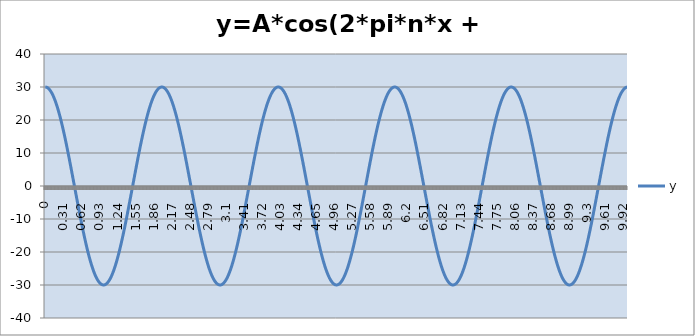
| Category | y |
|---|---|
| 0.0 | 30 |
| 0.01 | 29.985 |
| 0.02 | 29.941 |
| 0.03 | 29.867 |
| 0.04 | 29.763 |
| 0.05 | 29.631 |
| 0.060000000000000005 | 29.469 |
| 0.07 | 29.278 |
| 0.08 | 29.057 |
| 0.09 | 28.809 |
| 0.09999999999999999 | 28.532 |
| 0.10999999999999999 | 28.226 |
| 0.11999999999999998 | 27.893 |
| 0.12999999999999998 | 27.533 |
| 0.13999999999999999 | 27.145 |
| 0.15 | 26.73 |
| 0.16 | 26.289 |
| 0.17 | 25.822 |
| 0.18000000000000002 | 25.33 |
| 0.19000000000000003 | 24.812 |
| 0.20000000000000004 | 24.271 |
| 0.21000000000000005 | 23.705 |
| 0.22000000000000006 | 23.115 |
| 0.23000000000000007 | 22.503 |
| 0.24000000000000007 | 21.869 |
| 0.25000000000000006 | 21.213 |
| 0.26000000000000006 | 20.536 |
| 0.2700000000000001 | 19.839 |
| 0.2800000000000001 | 19.123 |
| 0.2900000000000001 | 18.387 |
| 0.3000000000000001 | 17.634 |
| 0.3100000000000001 | 16.863 |
| 0.3200000000000001 | 16.075 |
| 0.3300000000000001 | 15.271 |
| 0.34000000000000014 | 14.453 |
| 0.35000000000000014 | 13.62 |
| 0.36000000000000015 | 12.773 |
| 0.37000000000000016 | 11.914 |
| 0.38000000000000017 | 11.044 |
| 0.3900000000000002 | 10.162 |
| 0.4000000000000002 | 9.271 |
| 0.4100000000000002 | 8.37 |
| 0.4200000000000002 | 7.461 |
| 0.4300000000000002 | 6.544 |
| 0.4400000000000002 | 5.621 |
| 0.45000000000000023 | 4.693 |
| 0.46000000000000024 | 3.76 |
| 0.47000000000000025 | 2.823 |
| 0.48000000000000026 | 1.884 |
| 0.49000000000000027 | 0.942 |
| 0.5000000000000002 | 0 |
| 0.5100000000000002 | -0.942 |
| 0.5200000000000002 | -1.884 |
| 0.5300000000000002 | -2.823 |
| 0.5400000000000003 | -3.76 |
| 0.5500000000000003 | -4.693 |
| 0.5600000000000003 | -5.621 |
| 0.5700000000000003 | -6.544 |
| 0.5800000000000003 | -7.461 |
| 0.5900000000000003 | -8.37 |
| 0.6000000000000003 | -9.271 |
| 0.6100000000000003 | -10.162 |
| 0.6200000000000003 | -11.044 |
| 0.6300000000000003 | -11.914 |
| 0.6400000000000003 | -12.773 |
| 0.6500000000000004 | -13.62 |
| 0.6600000000000004 | -14.453 |
| 0.6700000000000004 | -15.271 |
| 0.6800000000000004 | -16.075 |
| 0.6900000000000004 | -16.863 |
| 0.7000000000000004 | -17.634 |
| 0.7100000000000004 | -18.387 |
| 0.7200000000000004 | -19.123 |
| 0.7300000000000004 | -19.839 |
| 0.7400000000000004 | -20.536 |
| 0.7500000000000004 | -21.213 |
| 0.7600000000000005 | -21.869 |
| 0.7700000000000005 | -22.503 |
| 0.7800000000000005 | -23.115 |
| 0.7900000000000005 | -23.705 |
| 0.8000000000000005 | -24.271 |
| 0.8100000000000005 | -24.812 |
| 0.8200000000000005 | -25.33 |
| 0.8300000000000005 | -25.822 |
| 0.8400000000000005 | -26.289 |
| 0.8500000000000005 | -26.73 |
| 0.8600000000000005 | -27.145 |
| 0.8700000000000006 | -27.533 |
| 0.8800000000000006 | -27.893 |
| 0.8900000000000006 | -28.226 |
| 0.9000000000000006 | -28.532 |
| 0.9100000000000006 | -28.809 |
| 0.9200000000000006 | -29.057 |
| 0.9300000000000006 | -29.278 |
| 0.9400000000000006 | -29.469 |
| 0.9500000000000006 | -29.631 |
| 0.9600000000000006 | -29.763 |
| 0.9700000000000006 | -29.867 |
| 0.9800000000000006 | -29.941 |
| 0.9900000000000007 | -29.985 |
| 1.0000000000000007 | -30 |
| 1.0100000000000007 | -29.985 |
| 1.0200000000000007 | -29.941 |
| 1.0300000000000007 | -29.867 |
| 1.0400000000000007 | -29.763 |
| 1.0500000000000007 | -29.631 |
| 1.0600000000000007 | -29.469 |
| 1.0700000000000007 | -29.278 |
| 1.0800000000000007 | -29.057 |
| 1.0900000000000007 | -28.809 |
| 1.1000000000000008 | -28.532 |
| 1.1100000000000008 | -28.226 |
| 1.1200000000000008 | -27.893 |
| 1.1300000000000008 | -27.533 |
| 1.1400000000000008 | -27.145 |
| 1.1500000000000008 | -26.73 |
| 1.1600000000000008 | -26.289 |
| 1.1700000000000008 | -25.822 |
| 1.1800000000000008 | -25.33 |
| 1.1900000000000008 | -24.812 |
| 1.2000000000000008 | -24.271 |
| 1.2100000000000009 | -23.705 |
| 1.2200000000000009 | -23.115 |
| 1.2300000000000009 | -22.503 |
| 1.2400000000000009 | -21.869 |
| 1.2500000000000009 | -21.213 |
| 1.260000000000001 | -20.536 |
| 1.270000000000001 | -19.839 |
| 1.280000000000001 | -19.123 |
| 1.290000000000001 | -18.387 |
| 1.300000000000001 | -17.634 |
| 1.310000000000001 | -16.863 |
| 1.320000000000001 | -16.075 |
| 1.330000000000001 | -15.271 |
| 1.340000000000001 | -14.453 |
| 1.350000000000001 | -13.62 |
| 1.360000000000001 | -12.773 |
| 1.370000000000001 | -11.914 |
| 1.380000000000001 | -11.044 |
| 1.390000000000001 | -10.162 |
| 1.400000000000001 | -9.271 |
| 1.410000000000001 | -8.37 |
| 1.420000000000001 | -7.461 |
| 1.430000000000001 | -6.544 |
| 1.440000000000001 | -5.621 |
| 1.450000000000001 | -4.693 |
| 1.460000000000001 | -3.76 |
| 1.470000000000001 | -2.823 |
| 1.480000000000001 | -1.884 |
| 1.490000000000001 | -0.942 |
| 1.500000000000001 | 0 |
| 1.5100000000000011 | 0.942 |
| 1.5200000000000011 | 1.884 |
| 1.5300000000000011 | 2.823 |
| 1.5400000000000011 | 3.76 |
| 1.5500000000000012 | 4.693 |
| 1.5600000000000012 | 5.621 |
| 1.5700000000000012 | 6.544 |
| 1.5800000000000012 | 7.461 |
| 1.5900000000000012 | 8.37 |
| 1.6000000000000012 | 9.271 |
| 1.6100000000000012 | 10.162 |
| 1.6200000000000012 | 11.044 |
| 1.6300000000000012 | 11.914 |
| 1.6400000000000012 | 12.773 |
| 1.6500000000000012 | 13.62 |
| 1.6600000000000013 | 14.453 |
| 1.6700000000000013 | 15.271 |
| 1.6800000000000013 | 16.075 |
| 1.6900000000000013 | 16.863 |
| 1.7000000000000013 | 17.634 |
| 1.7100000000000013 | 18.387 |
| 1.7200000000000013 | 19.123 |
| 1.7300000000000013 | 19.839 |
| 1.7400000000000013 | 20.536 |
| 1.7500000000000013 | 21.213 |
| 1.7600000000000013 | 21.869 |
| 1.7700000000000014 | 22.503 |
| 1.7800000000000014 | 23.115 |
| 1.7900000000000014 | 23.705 |
| 1.8000000000000014 | 24.271 |
| 1.8100000000000014 | 24.812 |
| 1.8200000000000014 | 25.33 |
| 1.8300000000000014 | 25.822 |
| 1.8400000000000014 | 26.289 |
| 1.8500000000000014 | 26.73 |
| 1.8600000000000014 | 27.145 |
| 1.8700000000000014 | 27.533 |
| 1.8800000000000014 | 27.893 |
| 1.8900000000000015 | 28.226 |
| 1.9000000000000015 | 28.532 |
| 1.9100000000000015 | 28.809 |
| 1.9200000000000015 | 29.057 |
| 1.9300000000000015 | 29.278 |
| 1.9400000000000015 | 29.469 |
| 1.9500000000000015 | 29.631 |
| 1.9600000000000015 | 29.763 |
| 1.9700000000000015 | 29.867 |
| 1.9800000000000015 | 29.941 |
| 1.9900000000000015 | 29.985 |
| 2.0000000000000013 | 30 |
| 2.010000000000001 | 29.985 |
| 2.020000000000001 | 29.941 |
| 2.0300000000000007 | 29.867 |
| 2.0400000000000005 | 29.763 |
| 2.0500000000000003 | 29.631 |
| 2.06 | 29.469 |
| 2.07 | 29.278 |
| 2.0799999999999996 | 29.057 |
| 2.0899999999999994 | 28.809 |
| 2.099999999999999 | 28.532 |
| 2.109999999999999 | 28.226 |
| 2.1199999999999988 | 27.893 |
| 2.1299999999999986 | 27.533 |
| 2.1399999999999983 | 27.145 |
| 2.149999999999998 | 26.73 |
| 2.159999999999998 | 26.289 |
| 2.1699999999999977 | 25.822 |
| 2.1799999999999975 | 25.33 |
| 2.1899999999999973 | 24.812 |
| 2.199999999999997 | 24.271 |
| 2.209999999999997 | 23.705 |
| 2.2199999999999966 | 23.115 |
| 2.2299999999999964 | 22.503 |
| 2.239999999999996 | 21.869 |
| 2.249999999999996 | 21.213 |
| 2.259999999999996 | 20.536 |
| 2.2699999999999956 | 19.839 |
| 2.2799999999999954 | 19.123 |
| 2.289999999999995 | 18.387 |
| 2.299999999999995 | 17.634 |
| 2.3099999999999947 | 16.863 |
| 2.3199999999999945 | 16.075 |
| 2.3299999999999943 | 15.271 |
| 2.339999999999994 | 14.453 |
| 2.349999999999994 | 13.62 |
| 2.3599999999999937 | 12.773 |
| 2.3699999999999934 | 11.914 |
| 2.3799999999999932 | 11.044 |
| 2.389999999999993 | 10.162 |
| 2.399999999999993 | 9.271 |
| 2.4099999999999926 | 8.37 |
| 2.4199999999999924 | 7.461 |
| 2.429999999999992 | 6.544 |
| 2.439999999999992 | 5.621 |
| 2.4499999999999917 | 4.693 |
| 2.4599999999999915 | 3.76 |
| 2.4699999999999913 | 2.823 |
| 2.479999999999991 | 1.884 |
| 2.489999999999991 | 0.942 |
| 2.4999999999999907 | 0 |
| 2.5099999999999905 | -0.942 |
| 2.5199999999999902 | -1.884 |
| 2.52999999999999 | -2.823 |
| 2.53999999999999 | -3.76 |
| 2.5499999999999896 | -4.693 |
| 2.5599999999999894 | -5.621 |
| 2.569999999999989 | -6.544 |
| 2.579999999999989 | -7.461 |
| 2.5899999999999888 | -8.37 |
| 2.5999999999999885 | -9.271 |
| 2.6099999999999883 | -10.162 |
| 2.619999999999988 | -11.044 |
| 2.629999999999988 | -11.914 |
| 2.6399999999999877 | -12.773 |
| 2.6499999999999875 | -13.62 |
| 2.6599999999999873 | -14.453 |
| 2.669999999999987 | -15.271 |
| 2.679999999999987 | -16.075 |
| 2.6899999999999866 | -16.863 |
| 2.6999999999999864 | -17.634 |
| 2.709999999999986 | -18.387 |
| 2.719999999999986 | -19.123 |
| 2.7299999999999858 | -19.839 |
| 2.7399999999999856 | -20.536 |
| 2.7499999999999853 | -21.213 |
| 2.759999999999985 | -21.869 |
| 2.769999999999985 | -22.503 |
| 2.7799999999999847 | -23.115 |
| 2.7899999999999845 | -23.705 |
| 2.7999999999999843 | -24.271 |
| 2.809999999999984 | -24.812 |
| 2.819999999999984 | -25.33 |
| 2.8299999999999836 | -25.822 |
| 2.8399999999999834 | -26.289 |
| 2.849999999999983 | -26.73 |
| 2.859999999999983 | -27.145 |
| 2.869999999999983 | -27.533 |
| 2.8799999999999826 | -27.893 |
| 2.8899999999999824 | -28.226 |
| 2.899999999999982 | -28.532 |
| 2.909999999999982 | -28.809 |
| 2.9199999999999817 | -29.057 |
| 2.9299999999999815 | -29.278 |
| 2.9399999999999813 | -29.469 |
| 2.949999999999981 | -29.631 |
| 2.959999999999981 | -29.763 |
| 2.9699999999999807 | -29.867 |
| 2.9799999999999804 | -29.941 |
| 2.9899999999999802 | -29.985 |
| 2.99999999999998 | -30 |
| 3.00999999999998 | -29.985 |
| 3.0199999999999796 | -29.941 |
| 3.0299999999999794 | -29.867 |
| 3.039999999999979 | -29.763 |
| 3.049999999999979 | -29.631 |
| 3.0599999999999787 | -29.469 |
| 3.0699999999999785 | -29.278 |
| 3.0799999999999783 | -29.057 |
| 3.089999999999978 | -28.809 |
| 3.099999999999978 | -28.532 |
| 3.1099999999999777 | -28.226 |
| 3.1199999999999775 | -27.893 |
| 3.1299999999999772 | -27.533 |
| 3.139999999999977 | -27.145 |
| 3.149999999999977 | -26.73 |
| 3.1599999999999766 | -26.289 |
| 3.1699999999999764 | -25.822 |
| 3.179999999999976 | -25.33 |
| 3.189999999999976 | -24.812 |
| 3.1999999999999758 | -24.271 |
| 3.2099999999999755 | -23.705 |
| 3.2199999999999753 | -23.115 |
| 3.229999999999975 | -22.503 |
| 3.239999999999975 | -21.869 |
| 3.2499999999999747 | -21.213 |
| 3.2599999999999745 | -20.536 |
| 3.2699999999999743 | -19.839 |
| 3.279999999999974 | -19.123 |
| 3.289999999999974 | -18.387 |
| 3.2999999999999736 | -17.634 |
| 3.3099999999999734 | -16.863 |
| 3.319999999999973 | -16.075 |
| 3.329999999999973 | -15.271 |
| 3.3399999999999728 | -14.453 |
| 3.3499999999999726 | -13.62 |
| 3.3599999999999723 | -12.773 |
| 3.369999999999972 | -11.914 |
| 3.379999999999972 | -11.044 |
| 3.3899999999999717 | -10.162 |
| 3.3999999999999715 | -9.271 |
| 3.4099999999999713 | -8.37 |
| 3.419999999999971 | -7.461 |
| 3.429999999999971 | -6.544 |
| 3.4399999999999706 | -5.621 |
| 3.4499999999999704 | -4.693 |
| 3.45999999999997 | -3.76 |
| 3.46999999999997 | -2.823 |
| 3.47999999999997 | -1.884 |
| 3.4899999999999696 | -0.942 |
| 3.4999999999999694 | 0 |
| 3.509999999999969 | 0.942 |
| 3.519999999999969 | 1.884 |
| 3.5299999999999687 | 2.823 |
| 3.5399999999999685 | 3.76 |
| 3.5499999999999683 | 4.693 |
| 3.559999999999968 | 5.621 |
| 3.569999999999968 | 6.544 |
| 3.5799999999999677 | 7.461 |
| 3.5899999999999674 | 8.37 |
| 3.5999999999999672 | 9.271 |
| 3.609999999999967 | 10.162 |
| 3.619999999999967 | 11.044 |
| 3.6299999999999666 | 11.914 |
| 3.6399999999999664 | 12.773 |
| 3.649999999999966 | 13.62 |
| 3.659999999999966 | 14.453 |
| 3.6699999999999657 | 15.271 |
| 3.6799999999999655 | 16.075 |
| 3.6899999999999653 | 16.863 |
| 3.699999999999965 | 17.634 |
| 3.709999999999965 | 18.387 |
| 3.7199999999999647 | 19.123 |
| 3.7299999999999645 | 19.839 |
| 3.7399999999999642 | 20.536 |
| 3.749999999999964 | 21.213 |
| 3.759999999999964 | 21.869 |
| 3.7699999999999636 | 22.503 |
| 3.7799999999999634 | 23.115 |
| 3.789999999999963 | 23.705 |
| 3.799999999999963 | 24.271 |
| 3.8099999999999627 | 24.812 |
| 3.8199999999999625 | 25.33 |
| 3.8299999999999623 | 25.822 |
| 3.839999999999962 | 26.289 |
| 3.849999999999962 | 26.73 |
| 3.8599999999999617 | 27.145 |
| 3.8699999999999615 | 27.533 |
| 3.8799999999999613 | 27.893 |
| 3.889999999999961 | 28.226 |
| 3.899999999999961 | 28.532 |
| 3.9099999999999606 | 28.809 |
| 3.9199999999999604 | 29.057 |
| 3.92999999999996 | 29.278 |
| 3.93999999999996 | 29.469 |
| 3.9499999999999598 | 29.631 |
| 3.9599999999999596 | 29.763 |
| 3.9699999999999593 | 29.867 |
| 3.979999999999959 | 29.941 |
| 3.989999999999959 | 29.985 |
| 3.9999999999999587 | 30 |
| 4.009999999999959 | 29.985 |
| 4.019999999999959 | 29.941 |
| 4.0299999999999585 | 29.867 |
| 4.039999999999958 | 29.763 |
| 4.049999999999958 | 29.631 |
| 4.059999999999958 | 29.469 |
| 4.069999999999958 | 29.278 |
| 4.079999999999957 | 29.057 |
| 4.089999999999957 | 28.809 |
| 4.099999999999957 | 28.532 |
| 4.109999999999957 | 28.226 |
| 4.119999999999957 | 27.893 |
| 4.129999999999956 | 27.533 |
| 4.139999999999956 | 27.145 |
| 4.149999999999956 | 26.73 |
| 4.159999999999956 | 26.289 |
| 4.1699999999999555 | 25.822 |
| 4.179999999999955 | 25.33 |
| 4.189999999999955 | 24.812 |
| 4.199999999999955 | 24.271 |
| 4.209999999999955 | 23.705 |
| 4.2199999999999545 | 23.115 |
| 4.229999999999954 | 22.503 |
| 4.239999999999954 | 21.869 |
| 4.249999999999954 | 21.213 |
| 4.259999999999954 | 20.536 |
| 4.269999999999953 | 19.839 |
| 4.279999999999953 | 19.123 |
| 4.289999999999953 | 18.387 |
| 4.299999999999953 | 17.634 |
| 4.3099999999999525 | 16.863 |
| 4.319999999999952 | 16.075 |
| 4.329999999999952 | 15.271 |
| 4.339999999999952 | 14.453 |
| 4.349999999999952 | 13.62 |
| 4.3599999999999515 | 12.773 |
| 4.369999999999951 | 11.914 |
| 4.379999999999951 | 11.044 |
| 4.389999999999951 | 10.162 |
| 4.399999999999951 | 9.271 |
| 4.40999999999995 | 8.37 |
| 4.41999999999995 | 7.461 |
| 4.42999999999995 | 6.544 |
| 4.43999999999995 | 5.621 |
| 4.4499999999999496 | 4.693 |
| 4.459999999999949 | 3.76 |
| 4.469999999999949 | 2.823 |
| 4.479999999999949 | 1.884 |
| 4.489999999999949 | 0.942 |
| 4.4999999999999485 | 0 |
| 4.509999999999948 | -0.942 |
| 4.519999999999948 | -1.884 |
| 4.529999999999948 | -2.823 |
| 4.539999999999948 | -3.76 |
| 4.549999999999947 | -4.693 |
| 4.559999999999947 | -5.621 |
| 4.569999999999947 | -6.544 |
| 4.579999999999947 | -7.461 |
| 4.589999999999947 | -8.37 |
| 4.599999999999946 | -9.271 |
| 4.609999999999946 | -10.162 |
| 4.619999999999946 | -11.044 |
| 4.629999999999946 | -11.914 |
| 4.6399999999999455 | -12.773 |
| 4.649999999999945 | -13.62 |
| 4.659999999999945 | -14.453 |
| 4.669999999999945 | -15.271 |
| 4.679999999999945 | -16.075 |
| 4.689999999999944 | -16.863 |
| 4.699999999999944 | -17.634 |
| 4.709999999999944 | -18.387 |
| 4.719999999999944 | -19.123 |
| 4.729999999999944 | -19.839 |
| 4.739999999999943 | -20.536 |
| 4.749999999999943 | -21.213 |
| 4.759999999999943 | -21.869 |
| 4.769999999999943 | -22.503 |
| 4.7799999999999425 | -23.115 |
| 4.789999999999942 | -23.705 |
| 4.799999999999942 | -24.271 |
| 4.809999999999942 | -24.812 |
| 4.819999999999942 | -25.33 |
| 4.8299999999999415 | -25.822 |
| 4.839999999999941 | -26.289 |
| 4.849999999999941 | -26.73 |
| 4.859999999999941 | -27.145 |
| 4.869999999999941 | -27.533 |
| 4.87999999999994 | -27.893 |
| 4.88999999999994 | -28.226 |
| 4.89999999999994 | -28.532 |
| 4.90999999999994 | -28.809 |
| 4.9199999999999395 | -29.057 |
| 4.929999999999939 | -29.278 |
| 4.939999999999939 | -29.469 |
| 4.949999999999939 | -29.631 |
| 4.959999999999939 | -29.763 |
| 4.9699999999999385 | -29.867 |
| 4.979999999999938 | -29.941 |
| 4.989999999999938 | -29.985 |
| 4.999999999999938 | -30 |
| 5.009999999999938 | -29.985 |
| 5.019999999999937 | -29.941 |
| 5.029999999999937 | -29.867 |
| 5.039999999999937 | -29.763 |
| 5.049999999999937 | -29.631 |
| 5.0599999999999365 | -29.469 |
| 5.069999999999936 | -29.278 |
| 5.079999999999936 | -29.057 |
| 5.089999999999936 | -28.809 |
| 5.099999999999936 | -28.532 |
| 5.1099999999999355 | -28.226 |
| 5.119999999999935 | -27.893 |
| 5.129999999999935 | -27.533 |
| 5.139999999999935 | -27.145 |
| 5.149999999999935 | -26.73 |
| 5.159999999999934 | -26.289 |
| 5.169999999999934 | -25.822 |
| 5.179999999999934 | -25.33 |
| 5.189999999999934 | -24.812 |
| 5.199999999999934 | -24.271 |
| 5.209999999999933 | -23.705 |
| 5.219999999999933 | -23.115 |
| 5.229999999999933 | -22.503 |
| 5.239999999999933 | -21.869 |
| 5.2499999999999325 | -21.213 |
| 5.259999999999932 | -20.536 |
| 5.269999999999932 | -19.839 |
| 5.279999999999932 | -19.123 |
| 5.289999999999932 | -18.387 |
| 5.299999999999931 | -17.634 |
| 5.309999999999931 | -16.863 |
| 5.319999999999931 | -16.075 |
| 5.329999999999931 | -15.271 |
| 5.339999999999931 | -14.453 |
| 5.34999999999993 | -13.62 |
| 5.35999999999993 | -12.773 |
| 5.36999999999993 | -11.914 |
| 5.37999999999993 | -11.044 |
| 5.3899999999999295 | -10.162 |
| 5.399999999999929 | -9.271 |
| 5.409999999999929 | -8.37 |
| 5.419999999999929 | -7.461 |
| 5.429999999999929 | -6.544 |
| 5.4399999999999284 | -5.621 |
| 5.449999999999928 | -4.693 |
| 5.459999999999928 | -3.76 |
| 5.469999999999928 | -2.823 |
| 5.479999999999928 | -1.884 |
| 5.489999999999927 | -0.942 |
| 5.499999999999927 | 0 |
| 5.509999999999927 | 0.942 |
| 5.519999999999927 | 1.884 |
| 5.5299999999999265 | 2.823 |
| 5.539999999999926 | 3.76 |
| 5.549999999999926 | 4.693 |
| 5.559999999999926 | 5.621 |
| 5.569999999999926 | 6.544 |
| 5.5799999999999255 | 7.461 |
| 5.589999999999925 | 8.37 |
| 5.599999999999925 | 9.271 |
| 5.609999999999925 | 10.162 |
| 5.619999999999925 | 11.044 |
| 5.629999999999924 | 11.914 |
| 5.639999999999924 | 12.773 |
| 5.649999999999924 | 13.62 |
| 5.659999999999924 | 14.453 |
| 5.6699999999999235 | 15.271 |
| 5.679999999999923 | 16.075 |
| 5.689999999999923 | 16.863 |
| 5.699999999999923 | 17.634 |
| 5.709999999999923 | 18.387 |
| 5.7199999999999225 | 19.123 |
| 5.729999999999922 | 19.839 |
| 5.739999999999922 | 20.536 |
| 5.749999999999922 | 21.213 |
| 5.759999999999922 | 21.869 |
| 5.769999999999921 | 22.503 |
| 5.779999999999921 | 23.115 |
| 5.789999999999921 | 23.705 |
| 5.799999999999921 | 24.271 |
| 5.809999999999921 | 24.812 |
| 5.81999999999992 | 25.33 |
| 5.82999999999992 | 25.822 |
| 5.83999999999992 | 26.289 |
| 5.84999999999992 | 26.73 |
| 5.8599999999999195 | 27.145 |
| 5.869999999999919 | 27.533 |
| 5.879999999999919 | 27.893 |
| 5.889999999999919 | 28.226 |
| 5.899999999999919 | 28.532 |
| 5.909999999999918 | 28.809 |
| 5.919999999999918 | 29.057 |
| 5.929999999999918 | 29.278 |
| 5.939999999999918 | 29.469 |
| 5.949999999999918 | 29.631 |
| 5.959999999999917 | 29.763 |
| 5.969999999999917 | 29.867 |
| 5.979999999999917 | 29.941 |
| 5.989999999999917 | 29.985 |
| 5.9999999999999165 | 30 |
| 6.009999999999916 | 29.985 |
| 6.019999999999916 | 29.941 |
| 6.029999999999916 | 29.867 |
| 6.039999999999916 | 29.763 |
| 6.0499999999999154 | 29.631 |
| 6.059999999999915 | 29.469 |
| 6.069999999999915 | 29.278 |
| 6.079999999999915 | 29.057 |
| 6.089999999999915 | 28.809 |
| 6.099999999999914 | 28.532 |
| 6.109999999999914 | 28.226 |
| 6.119999999999914 | 27.893 |
| 6.129999999999914 | 27.533 |
| 6.1399999999999135 | 27.145 |
| 6.149999999999913 | 26.73 |
| 6.159999999999913 | 26.289 |
| 6.169999999999913 | 25.822 |
| 6.179999999999913 | 25.33 |
| 6.1899999999999125 | 24.812 |
| 6.199999999999912 | 24.271 |
| 6.209999999999912 | 23.705 |
| 6.219999999999912 | 23.115 |
| 6.229999999999912 | 22.503 |
| 6.239999999999911 | 21.869 |
| 6.249999999999911 | 21.213 |
| 6.259999999999911 | 20.536 |
| 6.269999999999911 | 19.839 |
| 6.2799999999999105 | 19.123 |
| 6.28999999999991 | 18.387 |
| 6.29999999999991 | 17.634 |
| 6.30999999999991 | 16.863 |
| 6.31999999999991 | 16.075 |
| 6.3299999999999095 | 15.271 |
| 6.339999999999909 | 14.453 |
| 6.349999999999909 | 13.62 |
| 6.359999999999909 | 12.773 |
| 6.369999999999909 | 11.914 |
| 6.379999999999908 | 11.044 |
| 6.389999999999908 | 10.162 |
| 6.399999999999908 | 9.271 |
| 6.409999999999908 | 8.37 |
| 6.419999999999908 | 7.461 |
| 6.429999999999907 | 6.544 |
| 6.439999999999907 | 5.621 |
| 6.449999999999907 | 4.693 |
| 6.459999999999907 | 3.76 |
| 6.4699999999999065 | 2.823 |
| 6.479999999999906 | 1.884 |
| 6.489999999999906 | 0.942 |
| 6.499999999999906 | 0 |
| 6.509999999999906 | -0.942 |
| 6.519999999999905 | -1.884 |
| 6.529999999999905 | -2.823 |
| 6.539999999999905 | -3.76 |
| 6.549999999999905 | -4.693 |
| 6.559999999999905 | -5.621 |
| 6.569999999999904 | -6.544 |
| 6.579999999999904 | -7.461 |
| 6.589999999999904 | -8.37 |
| 6.599999999999904 | -9.271 |
| 6.6099999999999035 | -10.162 |
| 6.619999999999903 | -11.044 |
| 6.629999999999903 | -11.914 |
| 6.639999999999903 | -12.773 |
| 6.649999999999903 | -13.62 |
| 6.659999999999902 | -14.453 |
| 6.669999999999902 | -15.271 |
| 6.679999999999902 | -16.075 |
| 6.689999999999902 | -16.863 |
| 6.699999999999902 | -17.634 |
| 6.709999999999901 | -18.387 |
| 6.719999999999901 | -19.123 |
| 6.729999999999901 | -19.839 |
| 6.739999999999901 | -20.536 |
| 6.7499999999999005 | -21.213 |
| 6.7599999999999 | -21.869 |
| 6.7699999999999 | -22.503 |
| 6.7799999999999 | -23.115 |
| 6.7899999999999 | -23.705 |
| 6.7999999999998995 | -24.271 |
| 6.809999999999899 | -24.812 |
| 6.819999999999899 | -25.33 |
| 6.829999999999899 | -25.822 |
| 6.839999999999899 | -26.289 |
| 6.849999999999898 | -26.73 |
| 6.859999999999898 | -27.145 |
| 6.869999999999898 | -27.533 |
| 6.879999999999898 | -27.893 |
| 6.8899999999998975 | -28.226 |
| 6.899999999999897 | -28.532 |
| 6.909999999999897 | -28.809 |
| 6.919999999999897 | -29.057 |
| 6.929999999999897 | -29.278 |
| 6.9399999999998965 | -29.469 |
| 6.949999999999896 | -29.631 |
| 6.959999999999896 | -29.763 |
| 6.969999999999896 | -29.867 |
| 6.979999999999896 | -29.941 |
| 6.989999999999895 | -29.985 |
| 6.999999999999895 | -30 |
| 7.009999999999895 | -29.985 |
| 7.019999999999895 | -29.941 |
| 7.0299999999998946 | -29.867 |
| 7.039999999999894 | -29.763 |
| 7.049999999999894 | -29.631 |
| 7.059999999999894 | -29.469 |
| 7.069999999999894 | -29.278 |
| 7.0799999999998935 | -29.057 |
| 7.089999999999893 | -28.809 |
| 7.099999999999893 | -28.532 |
| 7.109999999999893 | -28.226 |
| 7.119999999999893 | -27.893 |
| 7.129999999999892 | -27.533 |
| 7.139999999999892 | -27.145 |
| 7.149999999999892 | -26.73 |
| 7.159999999999892 | -26.289 |
| 7.169999999999892 | -25.822 |
| 7.179999999999891 | -25.33 |
| 7.189999999999891 | -24.812 |
| 7.199999999999891 | -24.271 |
| 7.209999999999891 | -23.705 |
| 7.2199999999998905 | -23.115 |
| 7.22999999999989 | -22.503 |
| 7.23999999999989 | -21.869 |
| 7.24999999999989 | -21.213 |
| 7.25999999999989 | -20.536 |
| 7.269999999999889 | -19.839 |
| 7.279999999999889 | -19.123 |
| 7.289999999999889 | -18.387 |
| 7.299999999999889 | -17.634 |
| 7.309999999999889 | -16.863 |
| 7.319999999999888 | -16.075 |
| 7.329999999999888 | -15.271 |
| 7.339999999999888 | -14.453 |
| 7.349999999999888 | -13.62 |
| 7.3599999999998875 | -12.773 |
| 7.369999999999887 | -11.914 |
| 7.379999999999887 | -11.044 |
| 7.389999999999887 | -10.162 |
| 7.399999999999887 | -9.271 |
| 7.4099999999998865 | -8.37 |
| 7.419999999999886 | -7.461 |
| 7.429999999999886 | -6.544 |
| 7.439999999999886 | -5.621 |
| 7.449999999999886 | -4.693 |
| 7.459999999999885 | -3.76 |
| 7.469999999999885 | -2.823 |
| 7.479999999999885 | -1.884 |
| 7.489999999999885 | -0.942 |
| 7.4999999999998845 | 0 |
| 7.509999999999884 | 0.942 |
| 7.519999999999884 | 1.884 |
| 7.529999999999884 | 2.823 |
| 7.539999999999884 | 3.76 |
| 7.5499999999998835 | 4.693 |
| 7.559999999999883 | 5.621 |
| 7.569999999999883 | 6.544 |
| 7.579999999999883 | 7.461 |
| 7.589999999999883 | 8.37 |
| 7.599999999999882 | 9.271 |
| 7.609999999999882 | 10.162 |
| 7.619999999999882 | 11.044 |
| 7.629999999999882 | 11.914 |
| 7.6399999999998816 | 12.773 |
| 7.649999999999881 | 13.62 |
| 7.659999999999881 | 14.453 |
| 7.669999999999881 | 15.271 |
| 7.679999999999881 | 16.075 |
| 7.6899999999998805 | 16.863 |
| 7.69999999999988 | 17.634 |
| 7.70999999999988 | 18.387 |
| 7.71999999999988 | 19.123 |
| 7.72999999999988 | 19.839 |
| 7.739999999999879 | 20.536 |
| 7.749999999999879 | 21.213 |
| 7.759999999999879 | 21.869 |
| 7.769999999999879 | 22.503 |
| 7.779999999999879 | 23.115 |
| 7.789999999999878 | 23.705 |
| 7.799999999999878 | 24.271 |
| 7.809999999999878 | 24.812 |
| 7.819999999999878 | 25.33 |
| 7.8299999999998775 | 25.822 |
| 7.839999999999877 | 26.289 |
| 7.849999999999877 | 26.73 |
| 7.859999999999877 | 27.145 |
| 7.869999999999877 | 27.533 |
| 7.879999999999876 | 27.893 |
| 7.889999999999876 | 28.226 |
| 7.899999999999876 | 28.532 |
| 7.909999999999876 | 28.809 |
| 7.919999999999876 | 29.057 |
| 7.929999999999875 | 29.278 |
| 7.939999999999875 | 29.469 |
| 7.949999999999875 | 29.631 |
| 7.959999999999875 | 29.763 |
| 7.9699999999998745 | 29.867 |
| 7.979999999999874 | 29.941 |
| 7.989999999999874 | 29.985 |
| 7.999999999999874 | 30 |
| 8.009999999999874 | 29.985 |
| 8.019999999999873 | 29.941 |
| 8.029999999999873 | 29.867 |
| 8.039999999999873 | 29.763 |
| 8.049999999999873 | 29.631 |
| 8.059999999999873 | 29.469 |
| 8.069999999999872 | 29.278 |
| 8.079999999999872 | 29.057 |
| 8.089999999999872 | 28.809 |
| 8.099999999999872 | 28.532 |
| 8.109999999999872 | 28.226 |
| 8.119999999999871 | 27.893 |
| 8.129999999999871 | 27.533 |
| 8.139999999999871 | 27.145 |
| 8.14999999999987 | 26.73 |
| 8.15999999999987 | 26.289 |
| 8.16999999999987 | 25.822 |
| 8.17999999999987 | 25.33 |
| 8.18999999999987 | 24.812 |
| 8.19999999999987 | 24.271 |
| 8.20999999999987 | 23.705 |
| 8.21999999999987 | 23.115 |
| 8.229999999999869 | 22.503 |
| 8.239999999999869 | 21.869 |
| 8.249999999999869 | 21.213 |
| 8.259999999999868 | 20.536 |
| 8.269999999999868 | 19.839 |
| 8.279999999999868 | 19.123 |
| 8.289999999999868 | 18.387 |
| 8.299999999999867 | 17.634 |
| 8.309999999999867 | 16.863 |
| 8.319999999999867 | 16.075 |
| 8.329999999999867 | 15.271 |
| 8.339999999999867 | 14.453 |
| 8.349999999999866 | 13.62 |
| 8.359999999999866 | 12.773 |
| 8.369999999999866 | 11.914 |
| 8.379999999999866 | 11.044 |
| 8.389999999999866 | 10.162 |
| 8.399999999999865 | 9.271 |
| 8.409999999999865 | 8.37 |
| 8.419999999999865 | 7.461 |
| 8.429999999999865 | 6.544 |
| 8.439999999999864 | 5.621 |
| 8.449999999999864 | 4.693 |
| 8.459999999999864 | 3.76 |
| 8.469999999999864 | 2.823 |
| 8.479999999999864 | 1.884 |
| 8.489999999999863 | 0.942 |
| 8.499999999999863 | 0 |
| 8.509999999999863 | -0.942 |
| 8.519999999999863 | -1.884 |
| 8.529999999999863 | -2.823 |
| 8.539999999999862 | -3.76 |
| 8.549999999999862 | -4.693 |
| 8.559999999999862 | -5.621 |
| 8.569999999999862 | -6.544 |
| 8.579999999999862 | -7.461 |
| 8.589999999999861 | -8.37 |
| 8.599999999999861 | -9.271 |
| 8.60999999999986 | -10.162 |
| 8.61999999999986 | -11.044 |
| 8.62999999999986 | -11.914 |
| 8.63999999999986 | -12.773 |
| 8.64999999999986 | -13.62 |
| 8.65999999999986 | -14.453 |
| 8.66999999999986 | -15.271 |
| 8.67999999999986 | -16.075 |
| 8.68999999999986 | -16.863 |
| 8.699999999999859 | -17.634 |
| 8.709999999999859 | -18.387 |
| 8.719999999999859 | -19.123 |
| 8.729999999999858 | -19.839 |
| 8.739999999999858 | -20.536 |
| 8.749999999999858 | -21.213 |
| 8.759999999999858 | -21.869 |
| 8.769999999999857 | -22.503 |
| 8.779999999999857 | -23.115 |
| 8.789999999999857 | -23.705 |
| 8.799999999999857 | -24.271 |
| 8.809999999999857 | -24.812 |
| 8.819999999999856 | -25.33 |
| 8.829999999999856 | -25.822 |
| 8.839999999999856 | -26.289 |
| 8.849999999999856 | -26.73 |
| 8.859999999999856 | -27.145 |
| 8.869999999999855 | -27.533 |
| 8.879999999999855 | -27.893 |
| 8.889999999999855 | -28.226 |
| 8.899999999999855 | -28.532 |
| 8.909999999999854 | -28.809 |
| 8.919999999999854 | -29.057 |
| 8.929999999999854 | -29.278 |
| 8.939999999999854 | -29.469 |
| 8.949999999999854 | -29.631 |
| 8.959999999999853 | -29.763 |
| 8.969999999999853 | -29.867 |
| 8.979999999999853 | -29.941 |
| 8.989999999999853 | -29.985 |
| 8.999999999999853 | -30 |
| 9.009999999999852 | -29.985 |
| 9.019999999999852 | -29.941 |
| 9.029999999999852 | -29.867 |
| 9.039999999999852 | -29.763 |
| 9.049999999999851 | -29.631 |
| 9.059999999999851 | -29.469 |
| 9.069999999999851 | -29.278 |
| 9.07999999999985 | -29.057 |
| 9.08999999999985 | -28.809 |
| 9.09999999999985 | -28.532 |
| 9.10999999999985 | -28.226 |
| 9.11999999999985 | -27.893 |
| 9.12999999999985 | -27.533 |
| 9.13999999999985 | -27.145 |
| 9.14999999999985 | -26.73 |
| 9.15999999999985 | -26.289 |
| 9.169999999999849 | -25.822 |
| 9.179999999999849 | -25.33 |
| 9.189999999999849 | -24.812 |
| 9.199999999999848 | -24.271 |
| 9.209999999999848 | -23.705 |
| 9.219999999999848 | -23.115 |
| 9.229999999999848 | -22.503 |
| 9.239999999999847 | -21.869 |
| 9.249999999999847 | -21.213 |
| 9.259999999999847 | -20.536 |
| 9.269999999999847 | -19.839 |
| 9.279999999999847 | -19.123 |
| 9.289999999999846 | -18.387 |
| 9.299999999999846 | -17.634 |
| 9.309999999999846 | -16.863 |
| 9.319999999999846 | -16.075 |
| 9.329999999999846 | -15.271 |
| 9.339999999999845 | -14.453 |
| 9.349999999999845 | -13.62 |
| 9.359999999999845 | -12.773 |
| 9.369999999999845 | -11.914 |
| 9.379999999999844 | -11.044 |
| 9.389999999999844 | -10.162 |
| 9.399999999999844 | -9.271 |
| 9.409999999999844 | -8.37 |
| 9.419999999999844 | -7.461 |
| 9.429999999999843 | -6.544 |
| 9.439999999999843 | -5.621 |
| 9.449999999999843 | -4.693 |
| 9.459999999999843 | -3.76 |
| 9.469999999999843 | -2.823 |
| 9.479999999999842 | -1.884 |
| 9.489999999999842 | -0.942 |
| 9.499999999999842 | 0 |
| 9.509999999999842 | 0.942 |
| 9.519999999999841 | 1.884 |
| 9.529999999999841 | 2.823 |
| 9.539999999999841 | 3.76 |
| 9.54999999999984 | 4.693 |
| 9.55999999999984 | 5.621 |
| 9.56999999999984 | 6.544 |
| 9.57999999999984 | 7.461 |
| 9.58999999999984 | 8.37 |
| 9.59999999999984 | 9.271 |
| 9.60999999999984 | 10.162 |
| 9.61999999999984 | 11.044 |
| 9.62999999999984 | 11.914 |
| 9.639999999999839 | 12.773 |
| 9.649999999999839 | 13.62 |
| 9.659999999999838 | 14.453 |
| 9.669999999999838 | 15.271 |
| 9.679999999999838 | 16.075 |
| 9.689999999999838 | 16.863 |
| 9.699999999999838 | 17.634 |
| 9.709999999999837 | 18.387 |
| 9.719999999999837 | 19.123 |
| 9.729999999999837 | 19.839 |
| 9.739999999999837 | 20.536 |
| 9.749999999999837 | 21.213 |
| 9.759999999999836 | 21.869 |
| 9.769999999999836 | 22.503 |
| 9.779999999999836 | 23.115 |
| 9.789999999999836 | 23.705 |
| 9.799999999999836 | 24.271 |
| 9.809999999999835 | 24.812 |
| 9.819999999999835 | 25.33 |
| 9.829999999999835 | 25.822 |
| 9.839999999999835 | 26.289 |
| 9.849999999999834 | 26.73 |
| 9.859999999999834 | 27.145 |
| 9.869999999999834 | 27.533 |
| 9.879999999999834 | 27.893 |
| 9.889999999999834 | 28.226 |
| 9.899999999999833 | 28.532 |
| 9.909999999999833 | 28.809 |
| 9.919999999999833 | 29.057 |
| 9.929999999999833 | 29.278 |
| 9.939999999999833 | 29.469 |
| 9.949999999999832 | 29.631 |
| 9.959999999999832 | 29.763 |
| 9.969999999999832 | 29.867 |
| 9.979999999999832 | 29.941 |
| 9.989999999999831 | 29.985 |
| 9.999999999999831 | 30 |